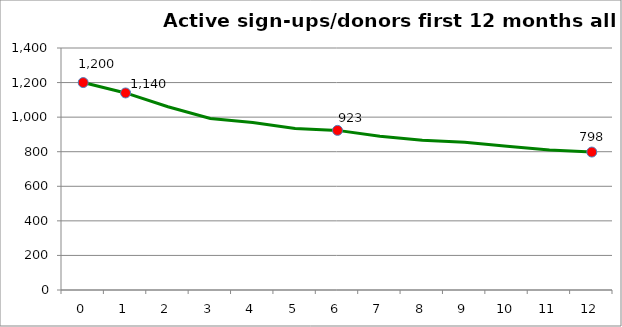
| Category | Sign-ups/donors |
|---|---|
| 0.0 | 1200 |
| 1.0 | 1140 |
| 2.0 | 1060.2 |
| 3.0 | 991.8 |
| 4.0 | 969 |
| 5.0 | 934.8 |
| 6.0 | 923.4 |
| 7.0 | 889.2 |
| 8.0 | 866.4 |
| 9.0 | 855 |
| 10.0 | 832.2 |
| 11.0 | 809.4 |
| 12.0 | 798 |